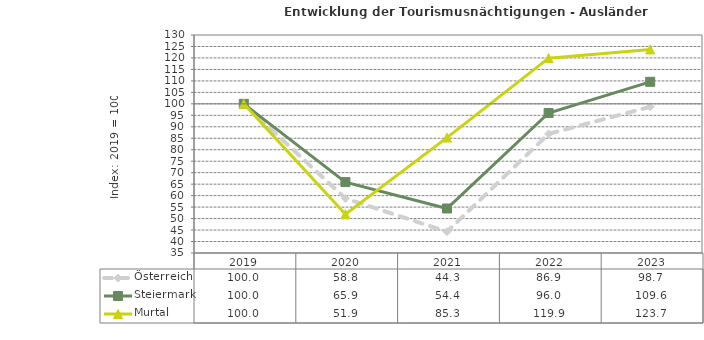
| Category | Österreich | Steiermark | Murtal |
|---|---|---|---|
| 2023.0 | 98.7 | 109.6 | 123.7 |
| 2022.0 | 86.9 | 96 | 119.9 |
| 2021.0 | 44.3 | 54.4 | 85.3 |
| 2020.0 | 58.8 | 65.9 | 51.9 |
| 2019.0 | 100 | 100 | 100 |